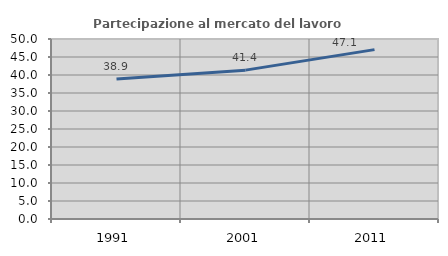
| Category | Partecipazione al mercato del lavoro  femminile |
|---|---|
| 1991.0 | 38.899 |
| 2001.0 | 41.351 |
| 2011.0 | 47.053 |